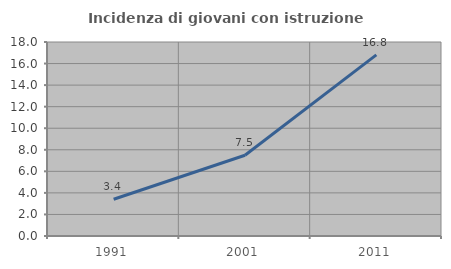
| Category | Incidenza di giovani con istruzione universitaria |
|---|---|
| 1991.0 | 3.41 |
| 2001.0 | 7.495 |
| 2011.0 | 16.805 |